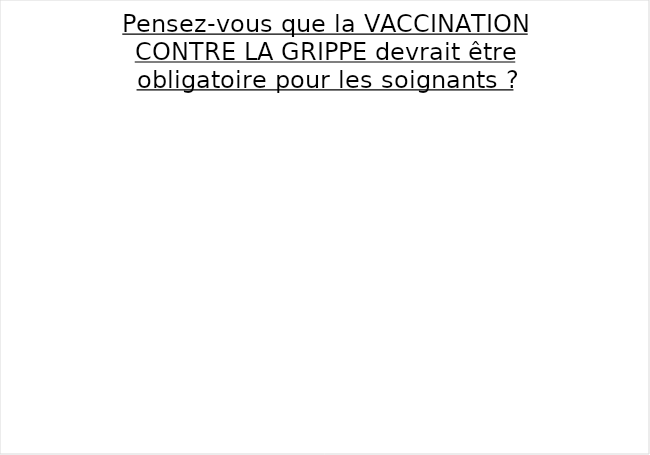
| Category | Series 0 |
|---|---|
| Oui | 0 |
| Non | 0 |
| Je pensais qu'elle l'était déjà | 0 |